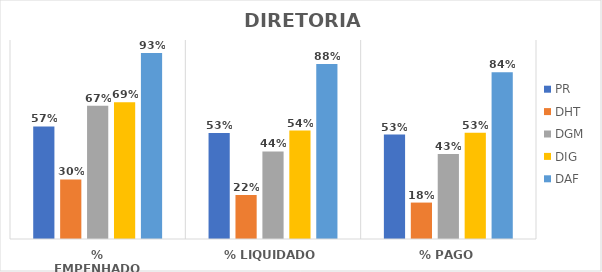
| Category | PR | DHT | DGM | DIG | DAF |
|---|---|---|---|---|---|
| % EMPENHADO | 0.566 | 0.299 | 0.67 | 0.687 | 0.934 |
| % LIQUIDADO | 0.533 | 0.221 | 0.44 | 0.545 | 0.88 |
| % PAGO | 0.525 | 0.183 | 0.427 | 0.533 | 0.838 |